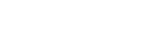
| Category | Series 0 | Series 1 | Series 2 | Series 3 | Series 4 | Series 5 |
|---|---|---|---|---|---|---|
| 0 | 0 | 0 | 0 | 0 | 0 | 0 |